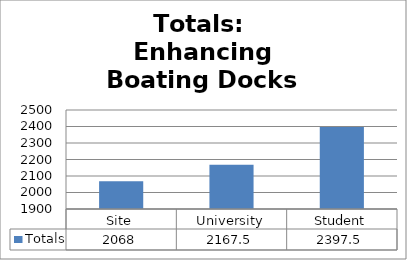
| Category | Totals |
|---|---|
| Site | 2068 |
| University | 2167.5 |
| Student | 2397.5 |